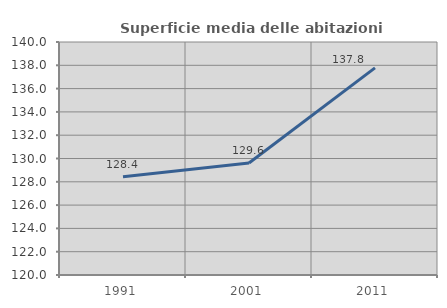
| Category | Superficie media delle abitazioni occupate |
|---|---|
| 1991.0 | 128.434 |
| 2001.0 | 129.609 |
| 2011.0 | 137.778 |